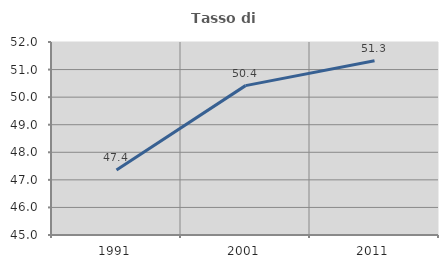
| Category | Tasso di occupazione   |
|---|---|
| 1991.0 | 47.355 |
| 2001.0 | 50.418 |
| 2011.0 | 51.32 |